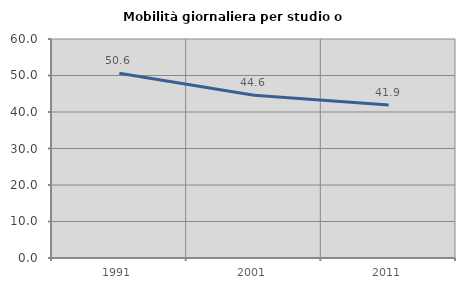
| Category | Mobilità giornaliera per studio o lavoro |
|---|---|
| 1991.0 | 50.609 |
| 2001.0 | 44.604 |
| 2011.0 | 41.909 |